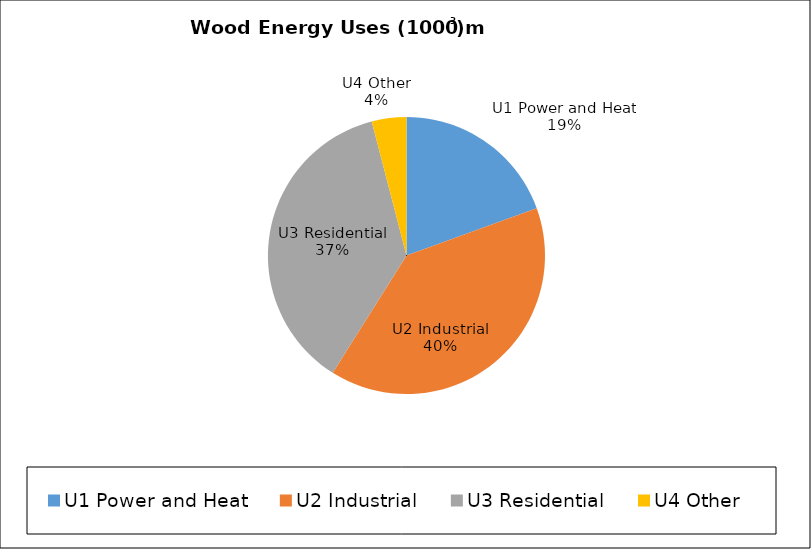
| Category | Series 0 |
|---|---|
| U1 Power and Heat | 0.195 |
| U2 Industrial | 0.395 |
| U3 Residential | 0.37 |
| U4 Other | 0.04 |